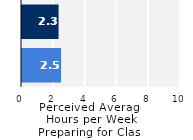
| Category | Series 0 |
|---|---|
| Upper Division | 2.457 |
| Lower Division | 2.3 |